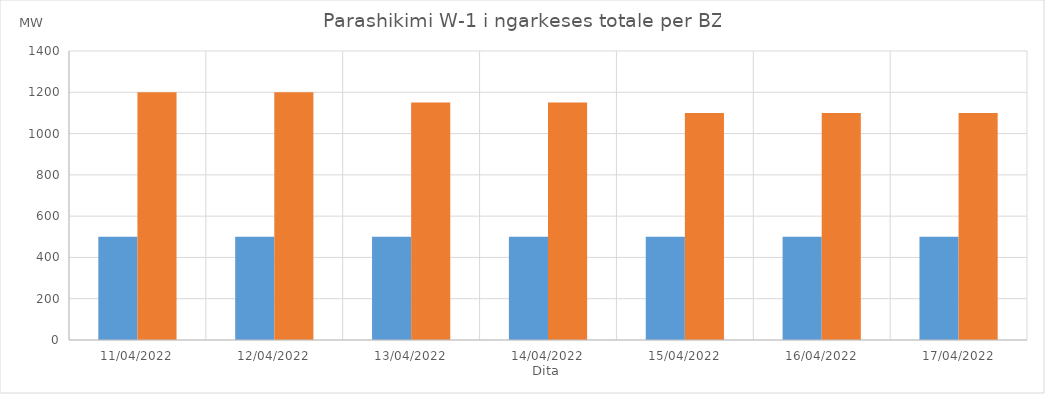
| Category | Min (MW) | Max (MW) |
|---|---|---|
| 11/04/2022 | 500 | 1200 |
| 12/04/2022 | 500 | 1200 |
| 13/04/2022 | 500 | 1150 |
| 14/04/2022 | 500 | 1150 |
| 15/04/2022 | 500 | 1100 |
| 16/04/2022 | 500 | 1100 |
| 17/04/2022 | 500 | 1100 |